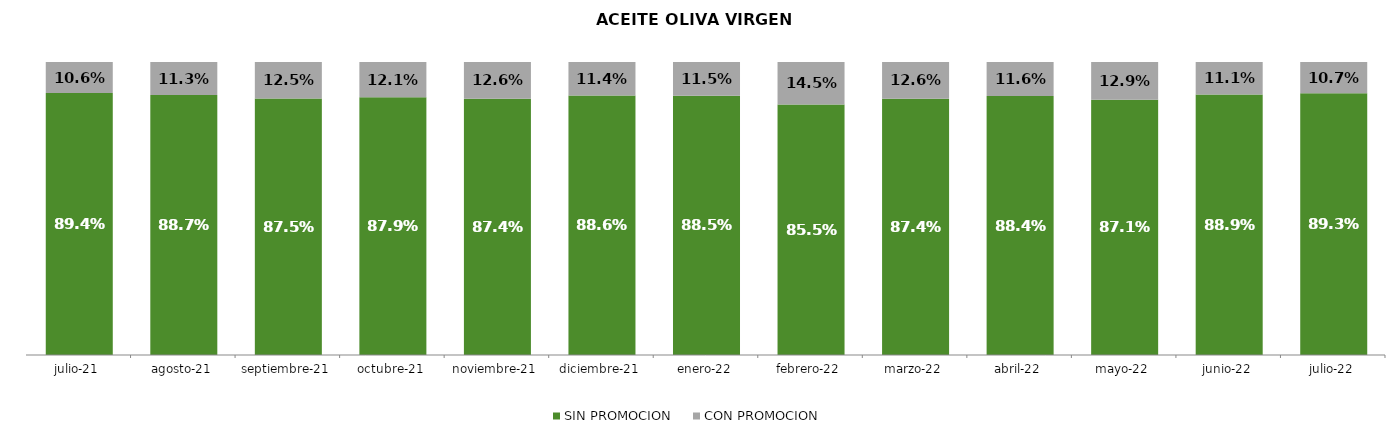
| Category | SIN PROMOCION   | CON PROMOCION   |
|---|---|---|
| 2021-07-01 | 0.894 | 0.106 |
| 2021-08-01 | 0.887 | 0.113 |
| 2021-09-01 | 0.875 | 0.125 |
| 2021-10-01 | 0.879 | 0.121 |
| 2021-11-01 | 0.874 | 0.126 |
| 2021-12-01 | 0.886 | 0.114 |
| 2022-01-01 | 0.885 | 0.115 |
| 2022-02-01 | 0.855 | 0.145 |
| 2022-03-01 | 0.874 | 0.126 |
| 2022-04-01 | 0.884 | 0.116 |
| 2022-05-01 | 0.871 | 0.129 |
| 2022-06-01 | 0.889 | 0.111 |
| 2022-07-01 | 0.893 | 0.107 |